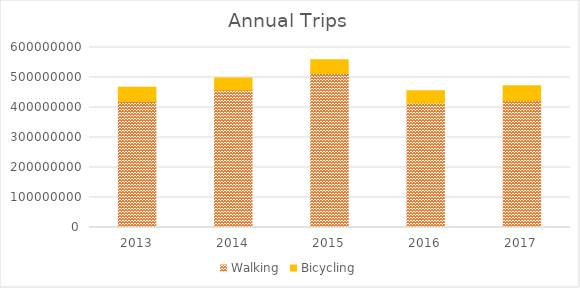
| Category | Walking | Bicycling |
|---|---|---|
| 2013 | 420195672.335 | 47363487.426 |
| 2014 | 458213545.796 | 40106941.19 |
| 2015 | 513110750.022 | 45823784.98 |
| 2016 | 415051771.042 | 40957121.394 |
| 2017 | 422650635.739 | 49508058.335 |